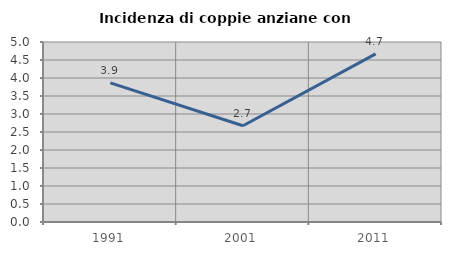
| Category | Incidenza di coppie anziane con figli |
|---|---|
| 1991.0 | 3.865 |
| 2001.0 | 2.673 |
| 2011.0 | 4.671 |